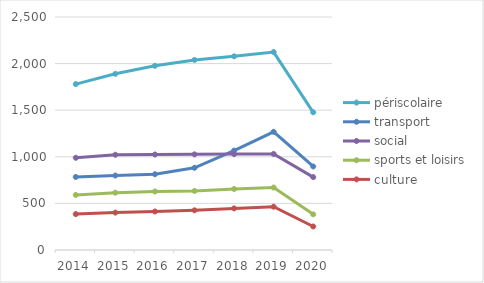
| Category | périscolaire | transport | social | sports et loisirs | culture |
|---|---|---|---|---|---|
| 2014.0 | 1780.058 | 783.8 | 989.321 | 590.775 | 385.27 |
| 2015.0 | 1890.318 | 799.119 | 1021.873 | 614.809 | 401.437 |
| 2016.0 | 1976.218 | 813.07 | 1024.503 | 627.867 | 413.201 |
| 2017.0 | 2039.465 | 881.998 | 1026.062 | 633.872 | 425.723 |
| 2018.0 | 2078.252 | 1066.604 | 1028.86 | 654.652 | 446.443 |
| 2019.0 | 2123.78 | 1268.338 | 1030.531 | 670.391 | 464.359 |
| 2020.0 | 1477.312 | 896.236 | 782.208 | 382.398 | 252.237 |